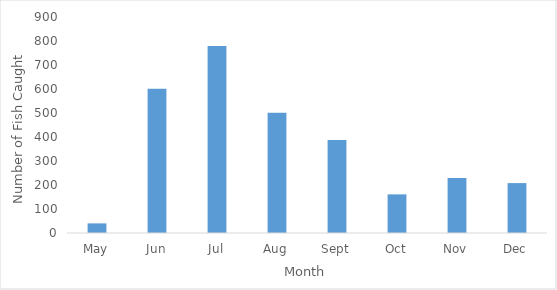
| Category | Series 0 |
|---|---|
| May | 40 |
| Jun | 601 |
| Jul | 779 |
| Aug | 501 |
| Sept | 387 |
| Oct | 161 |
| Nov | 229 |
| Dec | 208 |